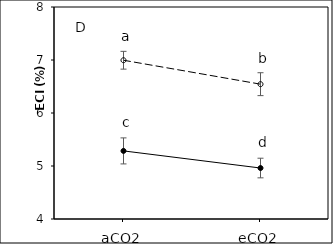
| Category | Bt | Xy |
|---|---|---|
| aCO2 | 5.285 | 6.995 |
| eCO2 | 4.962 | 6.544 |